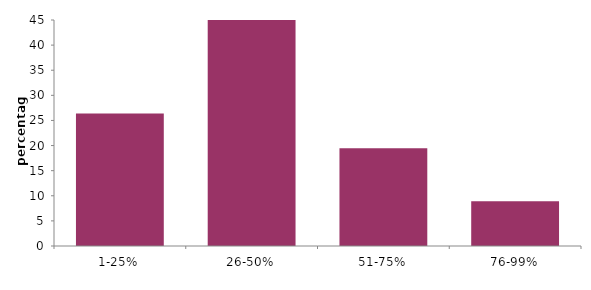
| Category | Series 0 |
|---|---|
| 1-25% | 26.361 |
| 26-50% | 45.132 |
| 51-75% | 19.446 |
| 76-99% | 8.889 |